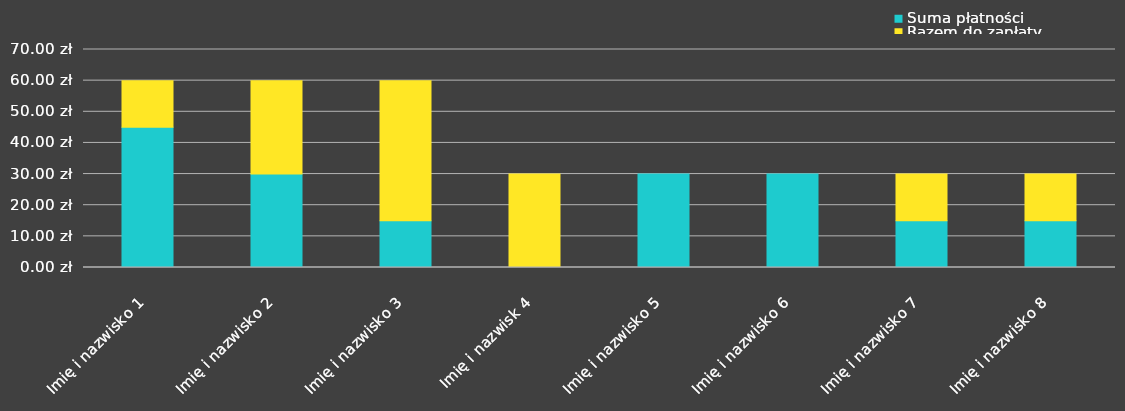
| Category | Suma płatności | Razem do zapłaty |
|---|---|---|
| Imię i nazwisko 1 | 45 | 15 |
| Imię i nazwisko 2 | 30 | 30 |
| Imię i nazwisko 3 | 15 | 45 |
| Imię i nazwisk 4 | 0 | 30 |
| Imię i nazwisko 5 | 30 | 0 |
| Imię i nazwisko 6 | 30 | 0 |
| Imię i nazwisko 7 | 15 | 15 |
| Imię i nazwisko 8 | 15 | 15 |